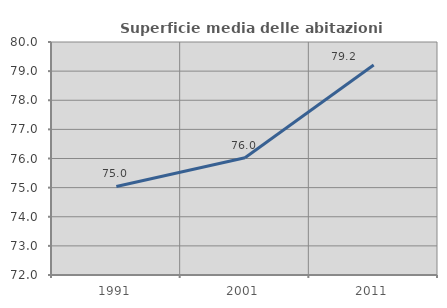
| Category | Superficie media delle abitazioni occupate |
|---|---|
| 1991.0 | 75.04 |
| 2001.0 | 76.027 |
| 2011.0 | 79.212 |